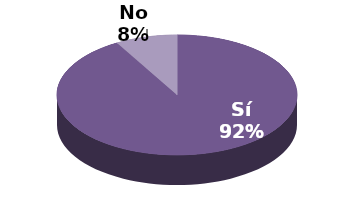
| Category | Series 1 |
|---|---|
| Sí | 11 |
| No | 1 |